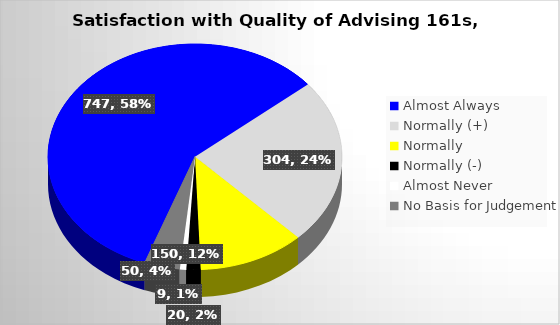
| Category | Series 0 |
|---|---|
| Almost Always | 747 |
| Normally (+) | 304 |
| Normally  | 150 |
| Normally (-) | 20 |
| Almost Never | 9 |
| No Basis for Judgement | 50 |